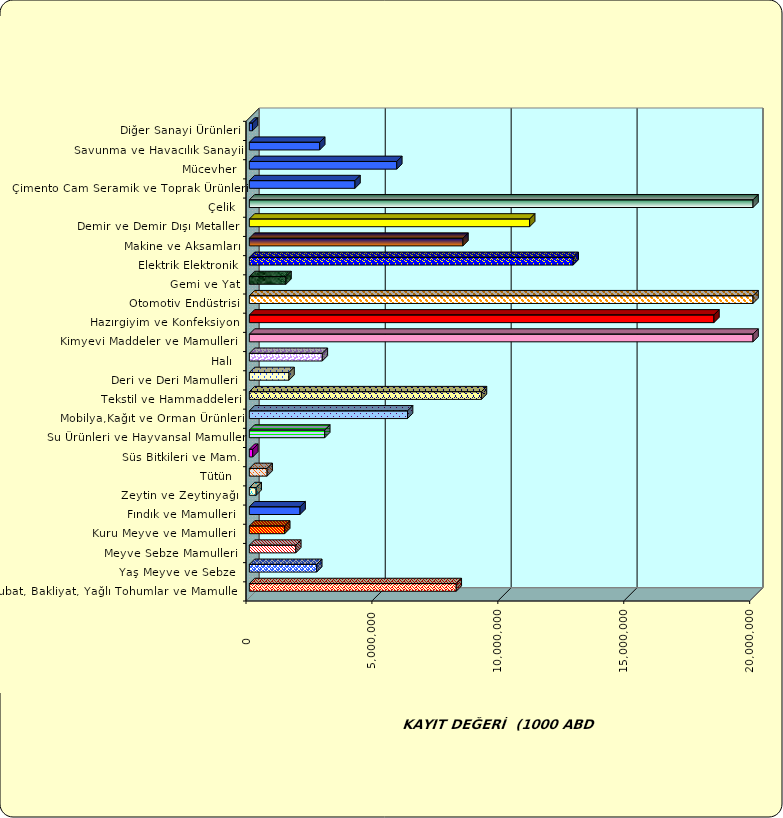
| Category | Series 0 |
|---|---|
|  Hububat, Bakliyat, Yağlı Tohumlar ve Mamulleri  | 8215251.743 |
|  Yaş Meyve ve Sebze   | 2674858.09 |
|  Meyve Sebze Mamulleri  | 1843996.923 |
|  Kuru Meyve ve Mamulleri   | 1403777.487 |
|  Fındık ve Mamulleri  | 2013696.909 |
|  Zeytin ve Zeytinyağı  | 270024.211 |
|  Tütün  | 705843.708 |
|  Süs Bitkileri ve Mam. | 134946.315 |
|  Su Ürünleri ve Hayvansal Mamuller | 2993144.117 |
|  Mobilya,Kağıt ve Orman Ürünleri | 6280866.733 |
|  Tekstil ve Hammaddeleri | 9215041.794 |
|  Deri ve Deri Mamulleri  | 1574274.415 |
|  Halı  | 2897069.019 |
|  Kimyevi Maddeler ve Mamulleri   | 22867329.819 |
|  Hazırgiyim ve Konfeksiyon  | 18447856.901 |
|  Otomotiv Endüstrisi | 26381498.04 |
|  Gemi ve Yat | 1455155.239 |
|  Elektrik Elektronik | 12858985.463 |
|  Makine ve Aksamları | 8481234.362 |
|  Demir ve Demir Dışı Metaller  | 11130958.236 |
|  Çelik | 20134642.298 |
|  Çimento Cam Seramik ve Toprak Ürünleri | 4194340.256 |
|  Mücevher | 5854737.222 |
|  Savunma ve Havacılık Sanayii | 2793973.834 |
|  Diğer Sanayi Ürünleri | 123895.425 |